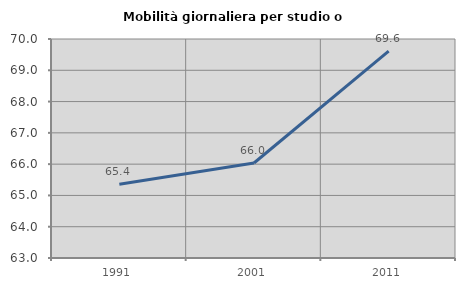
| Category | Mobilità giornaliera per studio o lavoro |
|---|---|
| 1991.0 | 65.359 |
| 2001.0 | 66.036 |
| 2011.0 | 69.612 |